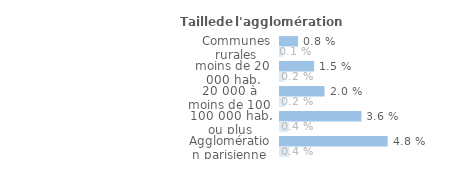
| Category | Series 1 | Series 0 |
|---|---|---|
| Communes rurales | 0.008 | 0.001 |
| moins de 20 000 hab. | 0.015 | 0.002 |
| 20 000 à moins de 100 000 hab. | 0.02 | 0.002 |
| 100 000 hab. ou plus | 0.036 | 0.004 |
| Agglomération parisienne | 0.048 | 0.004 |